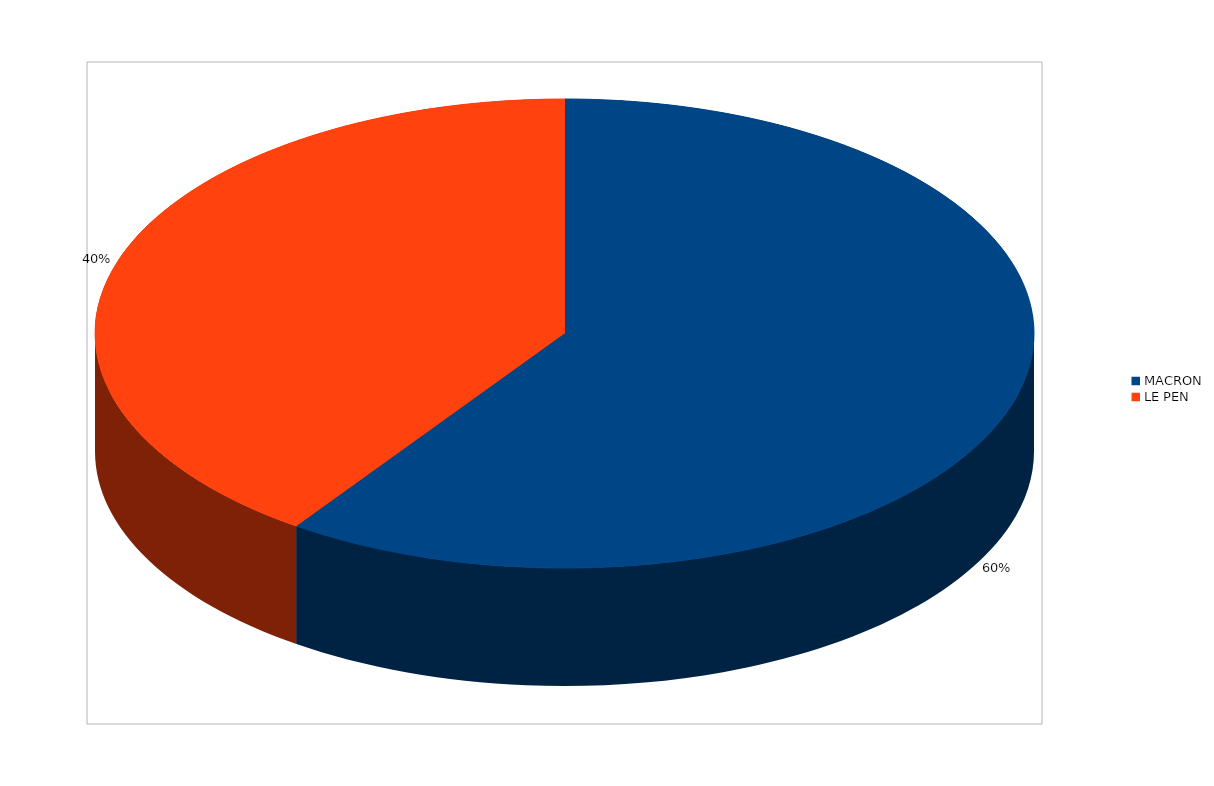
| Category | Series 0 |
|---|---|
| MACRON | 16467 |
| LE PEN | 11130 |